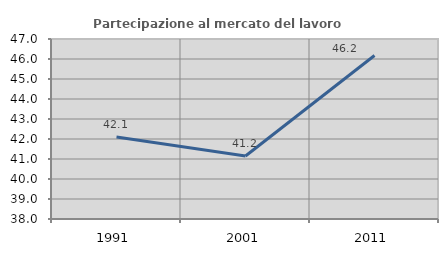
| Category | Partecipazione al mercato del lavoro  femminile |
|---|---|
| 1991.0 | 42.101 |
| 2001.0 | 41.153 |
| 2011.0 | 46.177 |